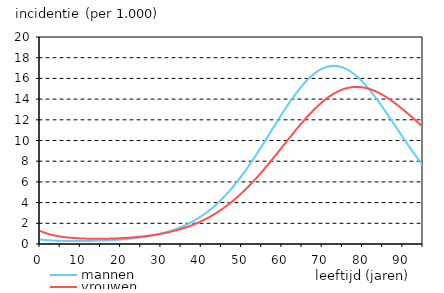
| Category | mannen | vrouwen |
|---|---|---|
| 0.0 | 0.431 | 1.274 |
| 1.0 | 0.394 | 1.11 |
| 2.0 | 0.365 | 0.979 |
| 3.0 | 0.342 | 0.875 |
| 4.0 | 0.324 | 0.791 |
| 5.0 | 0.311 | 0.723 |
| 6.0 | 0.3 | 0.668 |
| 7.0 | 0.293 | 0.624 |
| 8.0 | 0.289 | 0.589 |
| 9.0 | 0.287 | 0.561 |
| 10.0 | 0.288 | 0.54 |
| 11.0 | 0.291 | 0.524 |
| 12.0 | 0.297 | 0.512 |
| 13.0 | 0.304 | 0.506 |
| 14.0 | 0.314 | 0.503 |
| 15.0 | 0.326 | 0.504 |
| 16.0 | 0.341 | 0.508 |
| 17.0 | 0.359 | 0.516 |
| 18.0 | 0.38 | 0.527 |
| 19.0 | 0.404 | 0.542 |
| 20.0 | 0.431 | 0.56 |
| 21.0 | 0.462 | 0.582 |
| 22.0 | 0.497 | 0.607 |
| 23.0 | 0.538 | 0.637 |
| 24.0 | 0.583 | 0.671 |
| 25.0 | 0.634 | 0.71 |
| 26.0 | 0.692 | 0.753 |
| 27.0 | 0.756 | 0.802 |
| 28.0 | 0.829 | 0.857 |
| 29.0 | 0.91 | 0.919 |
| 30.0 | 1.001 | 0.987 |
| 31.0 | 1.102 | 1.063 |
| 32.0 | 1.215 | 1.146 |
| 33.0 | 1.341 | 1.239 |
| 34.0 | 1.48 | 1.341 |
| 35.0 | 1.635 | 1.453 |
| 36.0 | 1.806 | 1.577 |
| 37.0 | 1.995 | 1.712 |
| 38.0 | 2.203 | 1.86 |
| 39.0 | 2.432 | 2.022 |
| 40.0 | 2.682 | 2.198 |
| 41.0 | 2.955 | 2.389 |
| 42.0 | 3.252 | 2.596 |
| 43.0 | 3.574 | 2.82 |
| 44.0 | 3.923 | 3.062 |
| 45.0 | 4.298 | 3.322 |
| 46.0 | 4.701 | 3.601 |
| 47.0 | 5.131 | 3.898 |
| 48.0 | 5.589 | 4.216 |
| 49.0 | 6.073 | 4.552 |
| 50.0 | 6.583 | 4.908 |
| 51.0 | 7.118 | 5.283 |
| 52.0 | 7.675 | 5.677 |
| 53.0 | 8.253 | 6.088 |
| 54.0 | 8.849 | 6.515 |
| 55.0 | 9.459 | 6.958 |
| 56.0 | 10.079 | 7.415 |
| 57.0 | 10.705 | 7.883 |
| 58.0 | 11.332 | 8.36 |
| 59.0 | 11.956 | 8.845 |
| 60.0 | 12.57 | 9.333 |
| 61.0 | 13.169 | 9.823 |
| 62.0 | 13.747 | 10.31 |
| 63.0 | 14.299 | 10.792 |
| 64.0 | 14.817 | 11.266 |
| 65.0 | 15.298 | 11.726 |
| 66.0 | 15.734 | 12.171 |
| 67.0 | 16.122 | 12.596 |
| 68.0 | 16.456 | 12.998 |
| 69.0 | 16.733 | 13.374 |
| 70.0 | 16.95 | 13.72 |
| 71.0 | 17.104 | 14.035 |
| 72.0 | 17.193 | 14.314 |
| 73.0 | 17.218 | 14.557 |
| 74.0 | 17.177 | 14.762 |
| 75.0 | 17.071 | 14.926 |
| 76.0 | 16.904 | 15.05 |
| 77.0 | 16.676 | 15.133 |
| 78.0 | 16.391 | 15.174 |
| 79.0 | 16.054 | 15.175 |
| 80.0 | 15.669 | 15.136 |
| 81.0 | 15.239 | 15.059 |
| 82.0 | 14.772 | 14.945 |
| 83.0 | 14.271 | 14.797 |
| 84.0 | 13.744 | 14.616 |
| 85.0 | 13.194 | 14.405 |
| 86.0 | 12.629 | 14.167 |
| 87.0 | 12.052 | 13.906 |
| 88.0 | 11.47 | 13.623 |
| 89.0 | 10.886 | 13.322 |
| 90.0 | 10.306 | 13.007 |
| 91.0 | 9.733 | 12.68 |
| 92.0 | 9.171 | 12.344 |
| 93.0 | 8.624 | 12.002 |
| 94.0 | 8.093 | 11.658 |
| 95.0 | 7.581 | 11.313 |